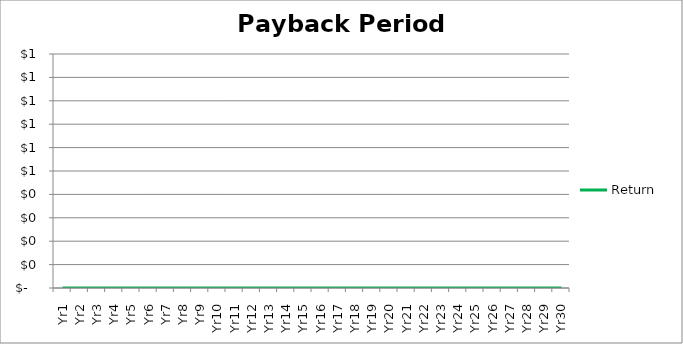
| Category | Return   |
|---|---|
| Yr1 | 0 |
| Yr2 | 0 |
| Yr3 | 0 |
| Yr4 | 0 |
| Yr5 | 0 |
| Yr6 | 0 |
| Yr7 | 0 |
| Yr8 | 0 |
| Yr9 | 0 |
| Yr10 | 0 |
| Yr11 | 0 |
| Yr12 | 0 |
| Yr13 | 0 |
| Yr14 | 0 |
| Yr15 | 0 |
| Yr16 | 0 |
| Yr17 | 0 |
| Yr18 | 0 |
| Yr19 | 0 |
| Yr20 | 0 |
| Yr21 | 0 |
| Yr22 | 0 |
| Yr23 | 0 |
| Yr24 | 0 |
| Yr25 | 0 |
| Yr26 | 0 |
| Yr27 | 0 |
| Yr28 | 0 |
| Yr29 | 0 |
| Yr30 | 0 |